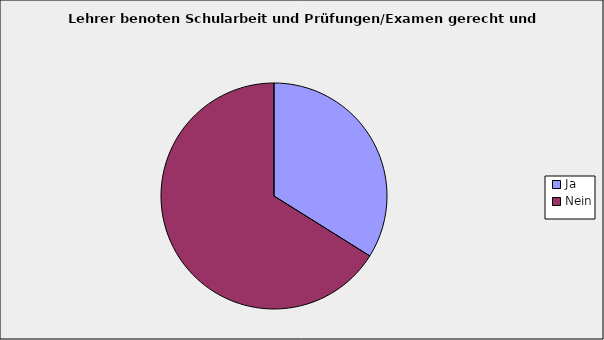
| Category | Series 0 |
|---|---|
| Ja | 0.339 |
| Nein | 0.661 |